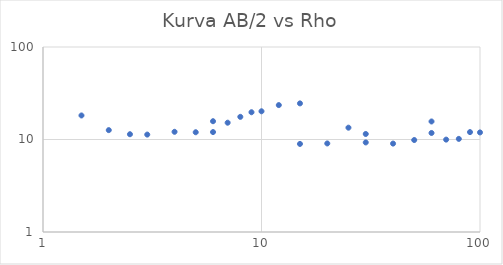
| Category | Series 0 |
|---|---|
| 1.5 | 18.191 |
| 2.0 | 12.627 |
| 2.5 | 11.401 |
| 3.0 | 11.302 |
| 4.0 | 12.113 |
| 5.0 | 11.98 |
| 6.0 | 12.034 |
| 6.0 | 15.763 |
| 7.0 | 15.192 |
| 8.0 | 17.572 |
| 9.0 | 19.711 |
| 10.0 | 20.193 |
| 12.0 | 23.55 |
| 15.0 | 24.57 |
| 15.0 | 8.958 |
| 20.0 | 9.063 |
| 25.0 | 13.421 |
| 30.0 | 11.473 |
| 30.0 | 9.295 |
| 40.0 | 9.032 |
| 50.0 | 9.87 |
| 60.0 | 11.764 |
| 60.0 | 15.664 |
| 70.0 | 9.971 |
| 80.0 | 10.155 |
| 90.0 | 12.021 |
| 100.0 | 11.925 |